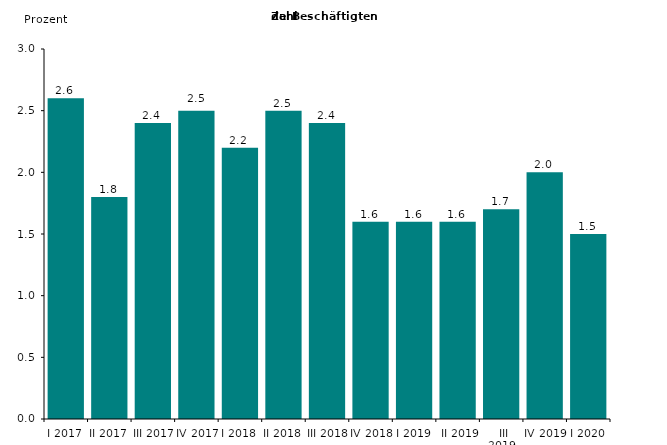
| Category | Series 0 |
|---|---|
| I 2017 | 2.6 |
| II 2017 | 1.8 |
| III 2017 | 2.4 |
| IV 2017 | 2.5 |
| I 2018 | 2.2 |
| II 2018 | 2.5 |
| III 2018 | 2.4 |
| IV 2018 | 1.6 |
| I 2019 | 1.6 |
|  II 2019 | 1.6 |
|  III 2019 | 1.7 |
| IV 2019 | 2 |
| I 2020 | 1.5 |